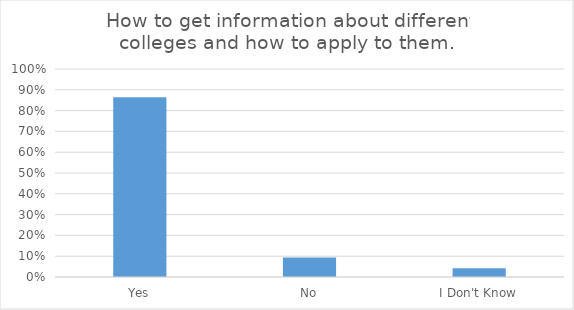
| Category | How to get information about different colleges and how to apply to them.  |
|---|---|
| Yes | 0.865 |
| No | 0.094 |
| I Don't Know | 0.042 |